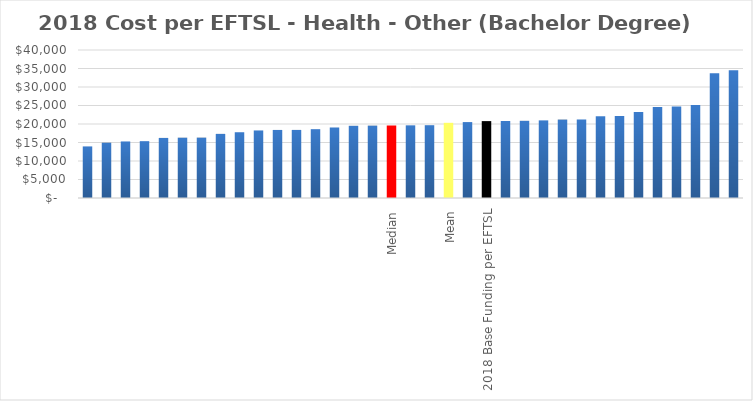
| Category | Series 0 |
|---|---|
|  | 13941.914 |
|  | 14943.833 |
|  | 15282.659 |
|  | 15360.488 |
|  | 16238.165 |
|  | 16297.759 |
|  | 16311.931 |
|  | 17329.555 |
|  | 17774.859 |
|  | 18259.3 |
|  | 18393.635 |
|  | 18399.776 |
|  | 18599.263 |
|  | 19058.343 |
|  | 19510.61 |
|  | 19552.399 |
| Median | 19595.974 |
|  | 19639.548 |
|  | 19676.466 |
| Mean | 20323.021 |
|  | 20517.5 |
| 2018 Base Funding per EFTSL | 20782.107 |